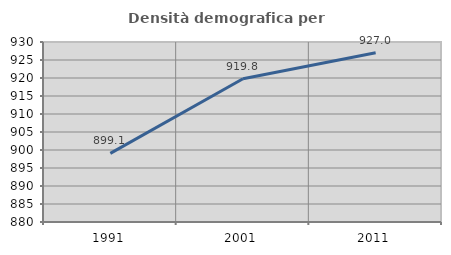
| Category | Densità demografica |
|---|---|
| 1991.0 | 899.061 |
| 2001.0 | 919.789 |
| 2011.0 | 927.036 |